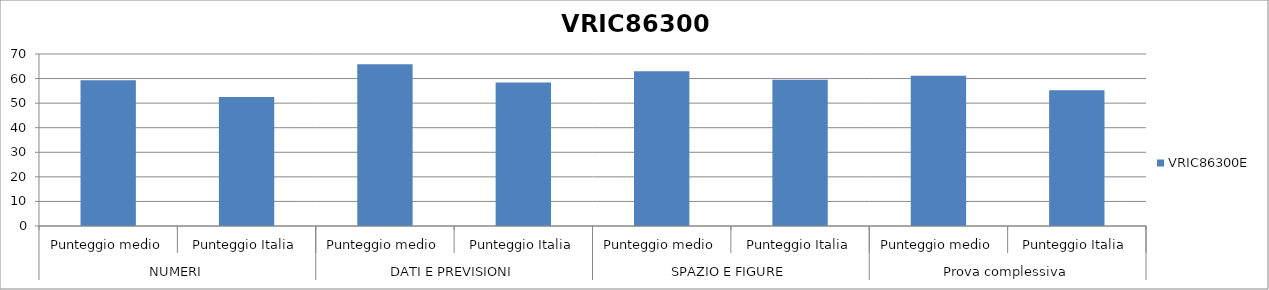
| Category | VRIC86300E |
|---|---|
| 0 | 59.3 |
| 1 | 52.5 |
| 2 | 65.8 |
| 3 | 58.4 |
| 4 | 63 |
| 5 | 59.5 |
| 6 | 61.1 |
| 7 | 55.2 |